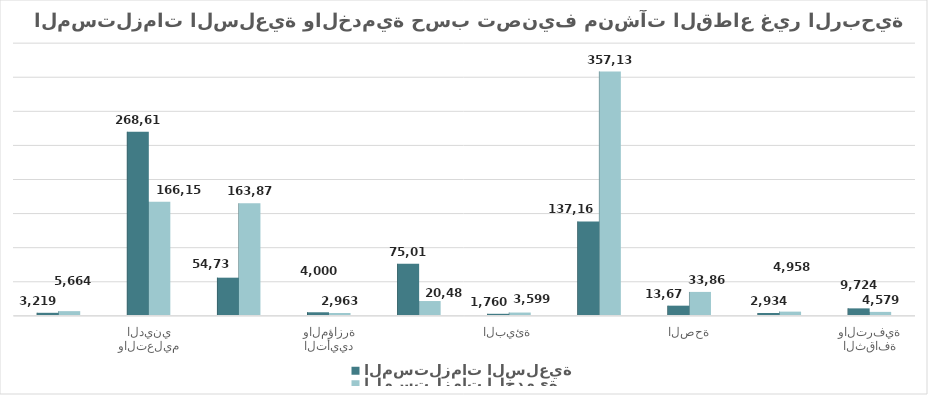
| Category | المستلزمات السلعية | المستلزمات الخدمية |
|---|---|---|
| الثقافة والترفية | 9724 | 4579 |
| التعليم والأبحاث | 2934 | 4958 |
| الصحة | 13678 | 33868 |
| الخدمات الاجتماعية | 137164 | 357138 |
| البيئة | 1760 | 3599 |
| التنمية والإسكان | 75010 | 20483 |
| التأييد والمؤازرة | 4000 | 2963 |
| منظمات دعم العمل الخيري | 54736 | 163879 |
| منظمات الدعوة والإرشاد والتعليم الديني | 268618 | 166150 |
| الجمعيات والروابط المهنية والعلمية | 3219 | 5664 |